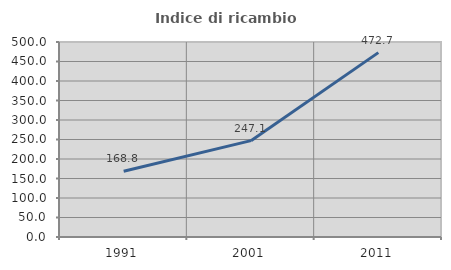
| Category | Indice di ricambio occupazionale  |
|---|---|
| 1991.0 | 168.75 |
| 2001.0 | 247.059 |
| 2011.0 | 472.727 |